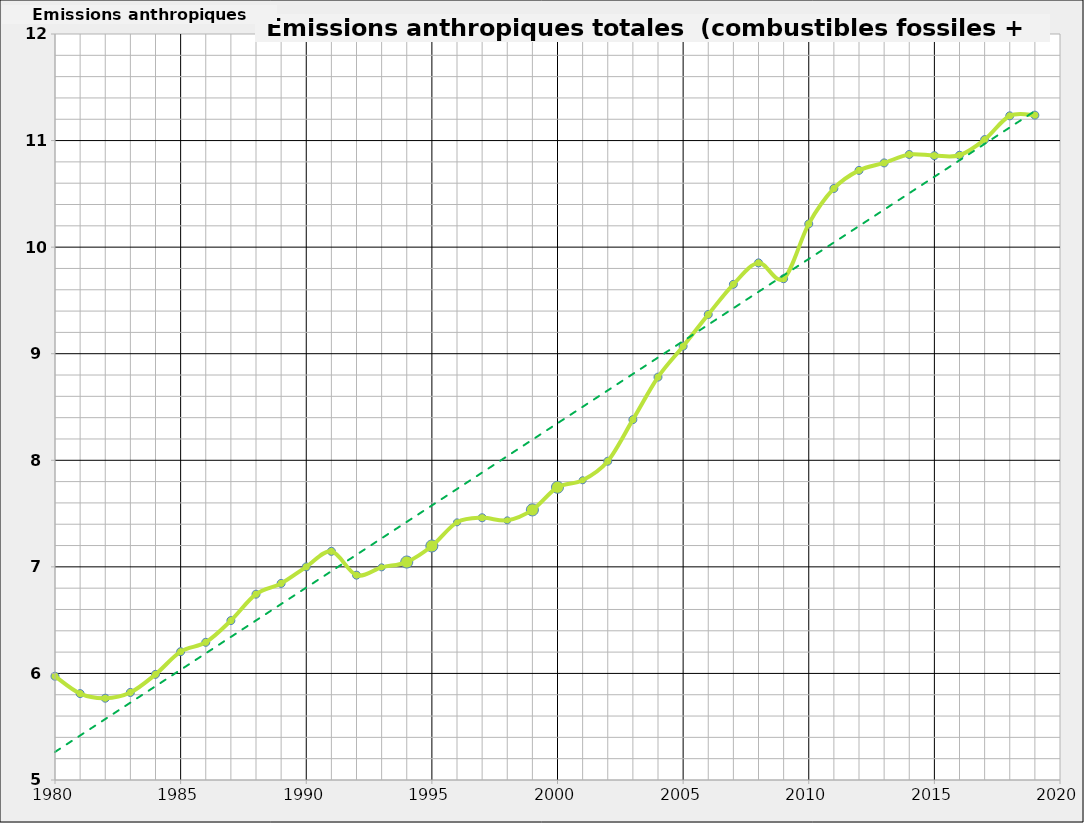
| Category | Emissions anthropiques (Gt-C/an) |
|---|---|
| 1980.0 | 5.974 |
| 1981.0 | 5.811 |
| 1982.0 | 5.767 |
| 1983.0 | 5.822 |
| 1984.0 | 5.991 |
| 1985.0 | 6.204 |
| 1986.0 | 6.292 |
| 1987.0 | 6.496 |
| 1988.0 | 6.744 |
| 1989.0 | 6.845 |
| 1990.0 | 7 |
| 1991.0 | 7.146 |
| 1992.0 | 6.922 |
| 1993.0 | 6.995 |
| 1994.0 | 7.045 |
| 1995.0 | 7.196 |
| 1996.0 | 7.417 |
| 1997.0 | 7.461 |
| 1998.0 | 7.436 |
| 1999.0 | 7.535 |
| 2000.0 | 7.747 |
| 2001.0 | 7.813 |
| 2002.0 | 7.991 |
| 2003.0 | 8.381 |
| 2004.0 | 8.78 |
| 2005.0 | 9.07 |
| 2006.0 | 9.368 |
| 2007.0 | 9.651 |
| 2008.0 | 9.852 |
| 2009.0 | 9.704 |
| 2010.0 | 10.218 |
| 2011.0 | 10.55 |
| 2012.0 | 10.72 |
| 2013.0 | 10.79 |
| 2014.0 | 10.87 |
| 2015.0 | 10.859 |
| 2016.0 | 10.862 |
| 2017.0 | 11.009 |
| 2018.0 | 11.232 |
| 2019.0 | 11.239 |